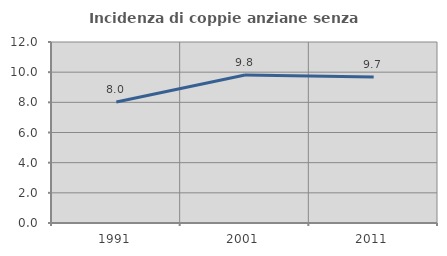
| Category | Incidenza di coppie anziane senza figli  |
|---|---|
| 1991.0 | 8.02 |
| 2001.0 | 9.812 |
| 2011.0 | 9.672 |